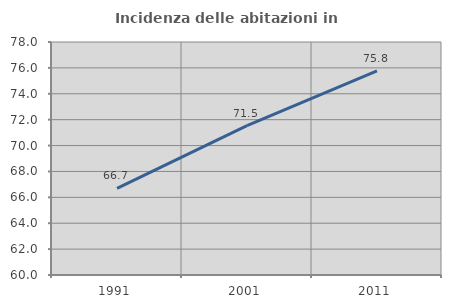
| Category | Incidenza delle abitazioni in proprietà  |
|---|---|
| 1991.0 | 66.691 |
| 2001.0 | 71.539 |
| 2011.0 | 75.772 |